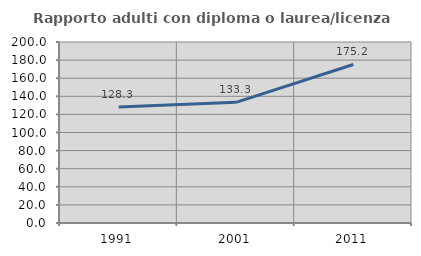
| Category | Rapporto adulti con diploma o laurea/licenza media  |
|---|---|
| 1991.0 | 128.302 |
| 2001.0 | 133.333 |
| 2011.0 | 175.177 |